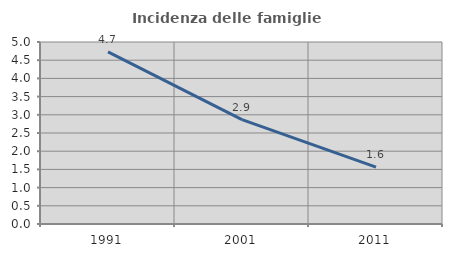
| Category | Incidenza delle famiglie numerose |
|---|---|
| 1991.0 | 4.73 |
| 2001.0 | 2.868 |
| 2011.0 | 1.562 |